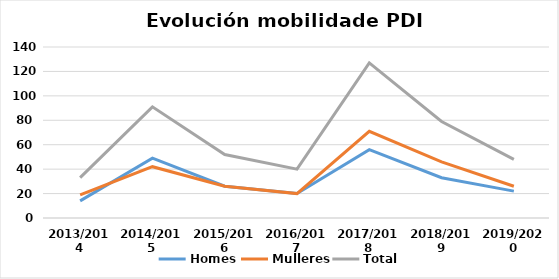
| Category | Homes | Mulleres | Total |
|---|---|---|---|
| 2013/2014 | 14 | 19 | 33 |
| 2014/2015 | 49 | 42 | 91 |
| 2015/2016 | 26 | 26 | 52 |
| 2016/2017 | 20 | 20 | 40 |
| 2017/2018 | 56 | 71 | 127 |
| 2018/2019 | 33 | 46 | 79 |
| 2019/2020 | 22 | 26 | 48 |